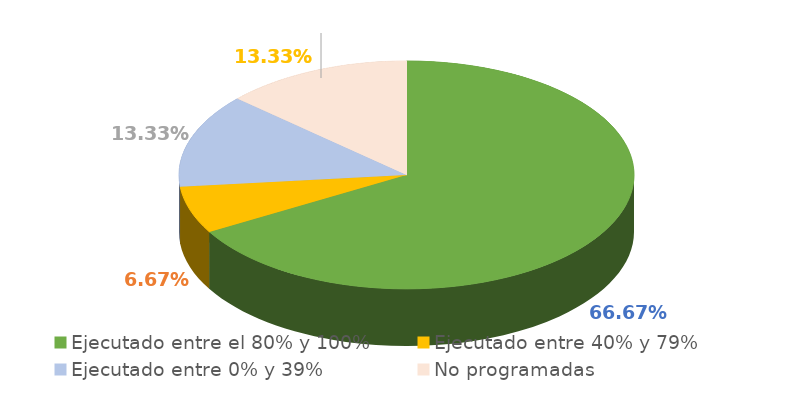
| Category | Series 0 |
|---|---|
| Ejecutado entre el 80% y 100% | 0.667 |
| Ejecutado entre 40% y 79% | 0.067 |
| Ejecutado entre 0% y 39% | 0.133 |
| No programadas | 0.133 |